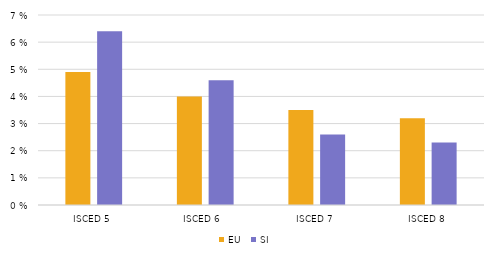
| Category | EU | SI |
|---|---|---|
| ISCED 5 | 0.049 | 0.064 |
| ISCED 6  | 0.04 | 0.046 |
| ISCED 7 | 0.035 | 0.026 |
| ISCED 8 | 0.032 | 0.023 |